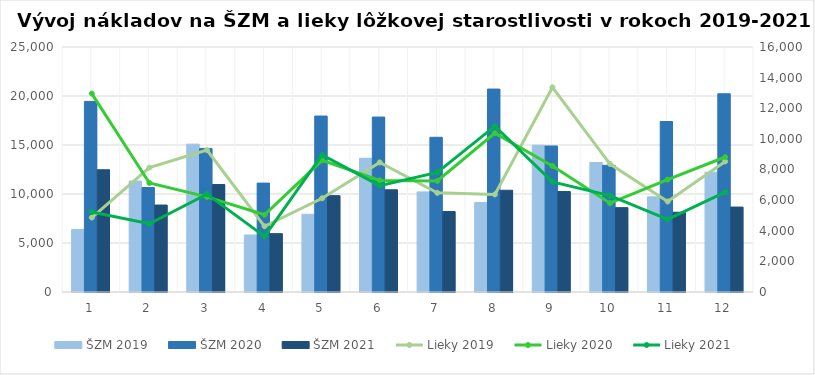
| Category | ŠZM 2019 | ŠZM 2020 | ŠZM 2021 |
|---|---|---|---|
| 0 | 6385.025 | 19445.23 | 12476.03 |
| 1 | 11324.264 | 10660.353 | 8872.957 |
| 2 | 15086.348 | 14652.394 | 10966.933 |
| 3 | 5819.256 | 11109.923 | 5952.781 |
| 4 | 7932.048 | 17955.186 | 9833.096 |
| 5 | 13643.336 | 17850.657 | 10429.468 |
| 6 | 10214.732 | 15788.205 | 8209.867 |
| 7 | 9132.539 | 20708.868 | 10383.024 |
| 8 | 14975.853 | 14901.024 | 10257.052 |
| 9 | 13215.066 | 12928.299 | 8609.403 |
| 10 | 9708.457 | 17395.281 | 8139.252 |
| 11 | 12227.163 | 20227.054 | 8667.013 |